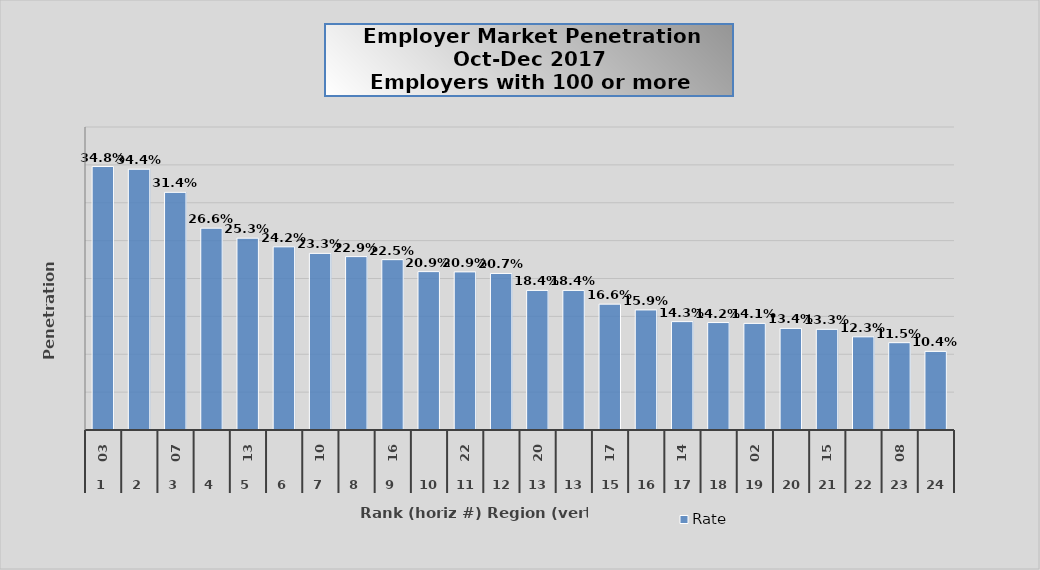
| Category | Rate |
|---|---|
| 0 | 0.348 |
| 1 | 0.344 |
| 2 | 0.314 |
| 3 | 0.266 |
| 4 | 0.253 |
| 5 | 0.242 |
| 6 | 0.233 |
| 7 | 0.229 |
| 8 | 0.225 |
| 9 | 0.209 |
| 10 | 0.209 |
| 11 | 0.207 |
| 12 | 0.184 |
| 13 | 0.184 |
| 14 | 0.166 |
| 15 | 0.159 |
| 16 | 0.143 |
| 17 | 0.142 |
| 18 | 0.141 |
| 19 | 0.134 |
| 20 | 0.133 |
| 21 | 0.123 |
| 22 | 0.115 |
| 23 | 0.104 |